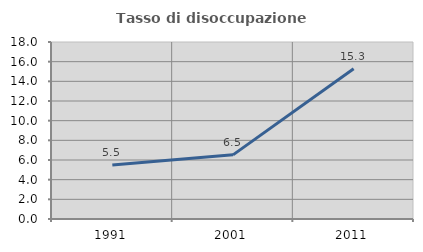
| Category | Tasso di disoccupazione giovanile  |
|---|---|
| 1991.0 | 5.479 |
| 2001.0 | 6.522 |
| 2011.0 | 15.278 |